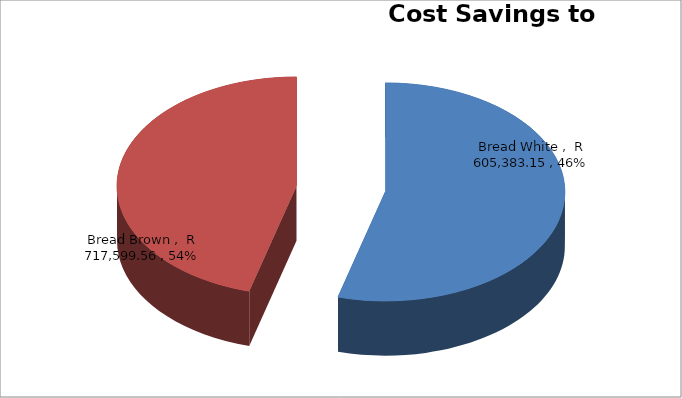
| Category | Series 0 |
|---|---|
| Bread Brown  | 717599.556 |
| Bread White  | 605383.149 |